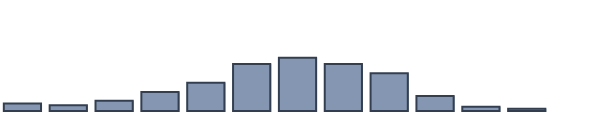
| Category | Series 0 |
|---|---|
| 0 | 2.739 |
| 1 | 2.087 |
| 2 | 3.696 |
| 3 | 6.87 |
| 4 | 10.174 |
| 5 | 16.957 |
| 6 | 19.174 |
| 7 | 16.913 |
| 8 | 13.565 |
| 9 | 5.435 |
| 10 | 1.565 |
| 11 | 0.826 |
| 12 | 0 |